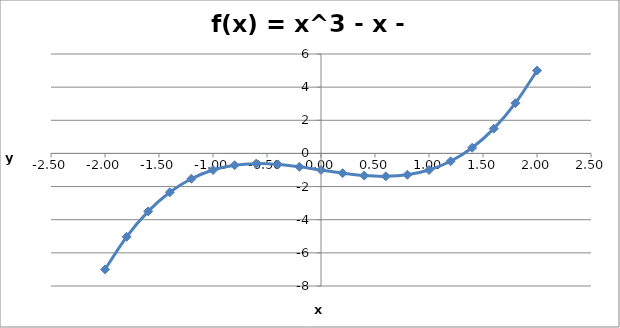
| Category | Series 0 |
|---|---|
| -2.0 | -7 |
| -1.8 | -5.032 |
| -1.6 | -3.496 |
| -1.4000000000000001 | -2.344 |
| -1.2000000000000002 | -1.528 |
| -1.0000000000000002 | -1 |
| -0.8000000000000003 | -0.712 |
| -0.6000000000000003 | -0.616 |
| -0.4000000000000003 | -0.664 |
| -0.2000000000000003 | -0.808 |
| -2.7755575615628914e-16 | -1 |
| 0.19999999999999973 | -1.192 |
| 0.39999999999999974 | -1.336 |
| 0.5999999999999998 | -1.384 |
| 0.7999999999999998 | -1.288 |
| 0.9999999999999998 | -1 |
| 1.1999999999999997 | -0.472 |
| 1.3999999999999997 | 0.344 |
| 1.5999999999999996 | 1.496 |
| 1.7999999999999996 | 3.032 |
| 1.9999999999999996 | 5 |